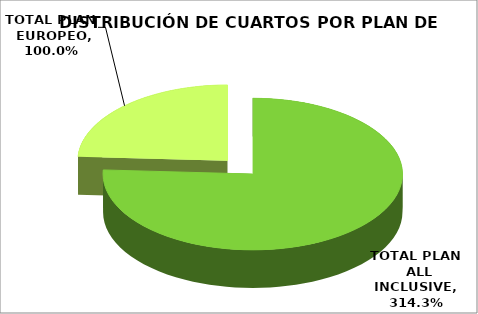
| Category | PLAN DE HOSPEDAJE |
|---|---|
| TOTAL PLAN  ALL INCLUSIVE | 3.143 |
| TOTAL PLAN  EUROPEO | 1 |